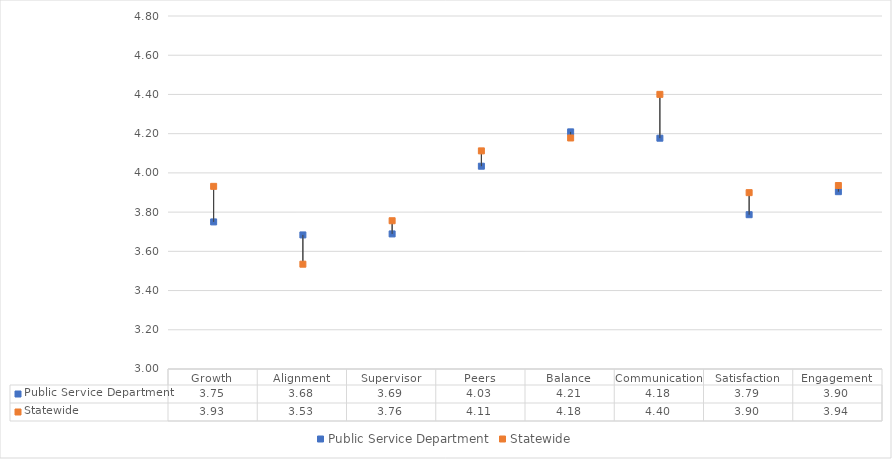
| Category | Public Service Department | Statewide |
|---|---|---|
| Growth | 3.75 | 3.931 |
| Alignment | 3.684 | 3.534 |
| Supervisor | 3.689 | 3.756 |
| Peers | 4.034 | 4.112 |
| Balance | 4.209 | 4.178 |
| Communication | 4.177 | 4.4 |
| Satisfaction | 3.787 | 3.899 |
| Engagement | 3.904 | 3.936 |